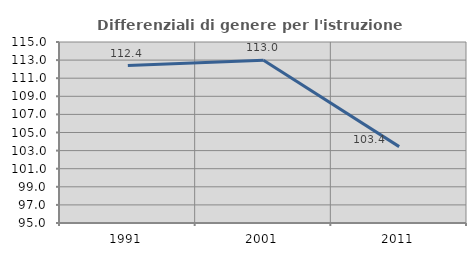
| Category | Differenziali di genere per l'istruzione superiore |
|---|---|
| 1991.0 | 112.392 |
| 2001.0 | 112.98 |
| 2011.0 | 103.44 |